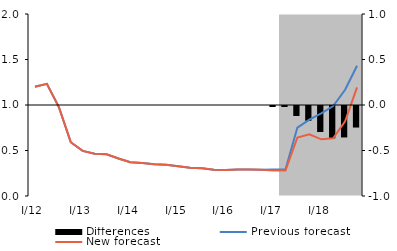
| Category | Differences |
|---|---|
| 0 | 0 |
| 1 | 0 |
| 2 | 0 |
| 3 | 0 |
| 4 | 0 |
| 5 | 0 |
| 6 | 0 |
| 7 | 0 |
| 8 | 0 |
| 9 | 0 |
| 10 | 0 |
| 11 | 0 |
| 12 | 0 |
| 13 | 0 |
| 14 | 0 |
| 15 | 0 |
| 16 | 0 |
| 17 | 0 |
| 18 | 0 |
| 19 | 0 |
| 20 | -0.011 |
| 21 | -0.011 |
| 22 | -0.11 |
| 23 | -0.162 |
| 24 | -0.286 |
| 25 | -0.355 |
| 26 | -0.345 |
| 27 | -0.237 |